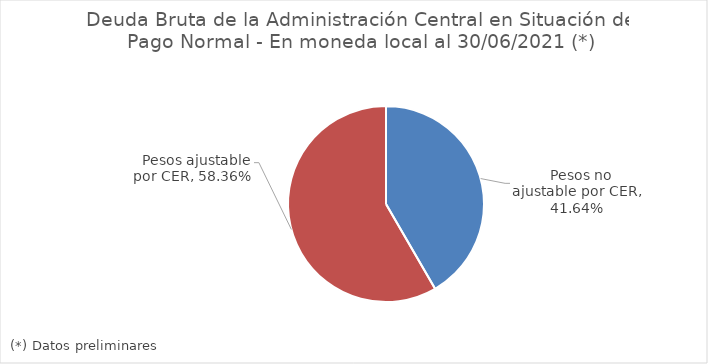
| Category | Series 0 |
|---|---|
|   Pesos no ajustable por CER | 0.416 |
|   Pesos ajustable por CER | 0.584 |